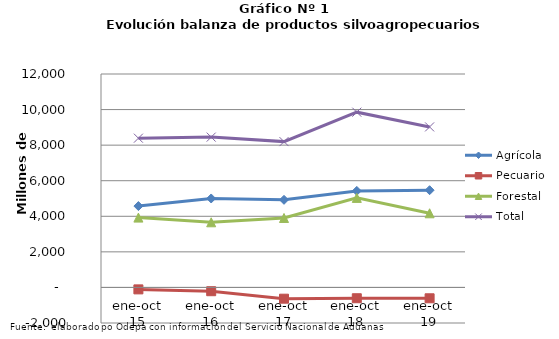
| Category | Agrícola | Pecuario | Forestal | Total |
|---|---|---|---|---|
| ene-oct 15 | 4574773 | -109858 | 3926197 | 8391112 |
| ene-oct 16 | 5001157 | -212897 | 3662865 | 8451125 |
| ene-oct 17 | 4925796 | -633252 | 3905440 | 8197984 |
| ene-oct 18 | 5426321 | -607584 | 5034391 | 9853128 |
| ene-oct 19 | 5467136 | -610685 | 4168755 | 9025206 |